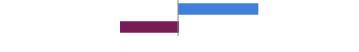
| Category | Series 0 |
|---|---|
| Favorable | 0.448 |
| Unfavorable | -0.328 |